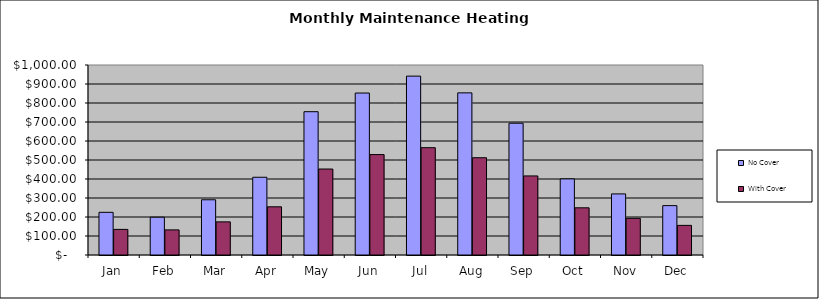
| Category | No Cover | With Cover |
|---|---|---|
| Jan | 224.609 | 134.765 |
| Feb | 198.895 | 132.123 |
| Mar | 290.67 | 174.402 |
| Apr | 409.154 | 253.676 |
| May | 754.201 | 452.521 |
| Jun | 852.405 | 528.491 |
| Jul | 941.375 | 564.825 |
| Aug | 853.293 | 511.976 |
| Sep | 693.645 | 416.187 |
| Oct | 400.63 | 248.391 |
| Nov | 321.499 | 192.899 |
| Dec | 259.841 | 155.905 |